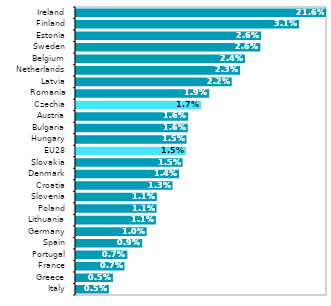
| Category | Series 0 |
|---|---|
| Italy | 0.005 |
| Greece | 0.005 |
| France | 0.007 |
| Portugal | 0.007 |
| Spain | 0.009 |
| Germany | 0.01 |
| Lithuania | 0.011 |
| Poland | 0.011 |
| Slovenia | 0.011 |
| Croatia | 0.013 |
| Denmark | 0.014 |
| Slovakia | 0.015 |
| EU28 | 0.015 |
| Hungary | 0.015 |
| Bulgaria | 0.016 |
| Austria | 0.016 |
| Czechia | 0.017 |
| Romania | 0.019 |
| Latvia | 0.022 |
| Netherlands | 0.023 |
| Belgium | 0.024 |
| Sweden | 0.026 |
| Estonia | 0.026 |
| Finland | 0.031 |
| Ireland | 0.216 |